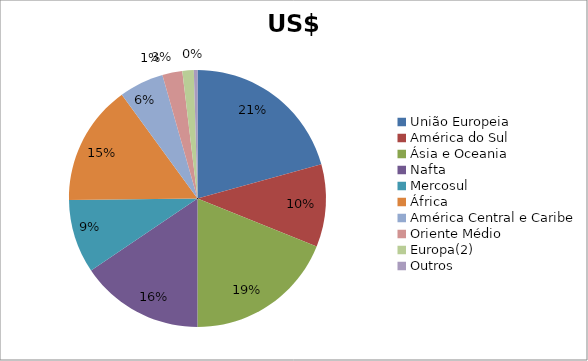
| Category | Series 0 |
|---|---|
| União Europeia | 886763655 |
| América do Sul | 445095476 |
| Ásia e Oceania | 809998299 |
| Nafta | 664990227 |
| Mercosul | 398027233 |
| África | 648874224 |
| América Central e Caribe | 240514983 |
| Oriente Médio | 107755404 |
| Europa(2) | 61323534 |
| Outros | 19599008 |